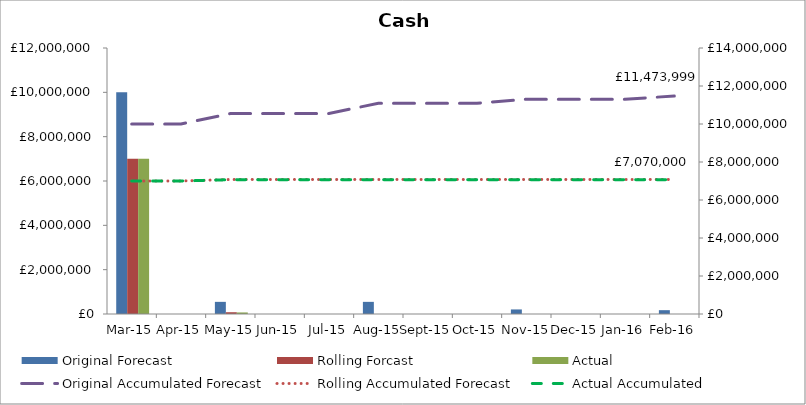
| Category | Original Forecast | Rolling Forcast | Actual |
|---|---|---|---|
| 2015-03-01 | 10000000 | 7000000 | 7000000 |
| 2015-04-01 | 0 | 0 | 0 |
| 2015-05-01 | 547833 | 80000 | 70000 |
| 2015-06-01 | 0 | 0 | 0 |
| 2015-07-01 | 0 | 0 | 0 |
| 2015-08-01 | 547833 | 0 | 0 |
| 2015-09-01 | 0 | 0 | 0 |
| 2015-10-01 | 0 | 0 | 0 |
| 2015-11-01 | 205833 | 0 | 0 |
| 2015-12-01 | 0 | 0 | 0 |
| 2016-01-01 | 0 | 0 | 0 |
| 2016-02-01 | 172500 | 0 | 0 |